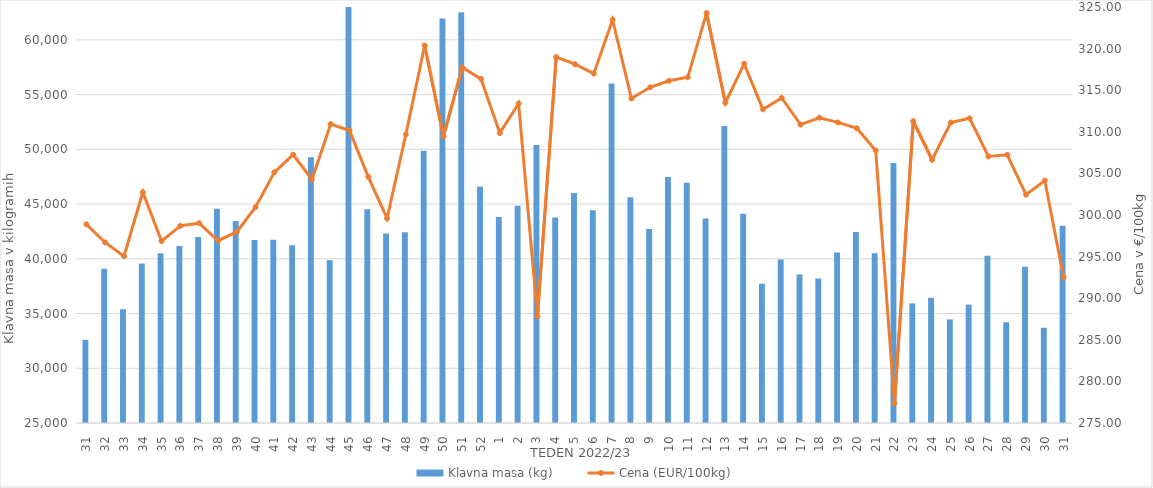
| Category | Klavna masa (kg) |
|---|---|
| 31.0 | 32599 |
| 32.0 | 39100 |
| 33.0 | 35388 |
| 34.0 | 39563 |
| 35.0 | 40507 |
| 36.0 | 41176 |
| 37.0 | 41983 |
| 38.0 | 44572 |
| 39.0 | 43447 |
| 40.0 | 41711 |
| 41.0 | 41736 |
| 42.0 | 41239 |
| 43.0 | 49284 |
| 44.0 | 39877 |
| 45.0 | 63668 |
| 46.0 | 44528 |
| 47.0 | 42319 |
| 48.0 | 42416 |
| 49.0 | 49873 |
| 50.0 | 61942 |
| 51.0 | 62514 |
| 52.0 | 46589 |
| 1.0 | 43807 |
| 2.0 | 44834 |
| 3.0 | 50386 |
| 4.0 | 43773 |
| 5.0 | 46011 |
| 6.0 | 44439 |
| 7.0 | 56001 |
| 8.0 | 45613 |
| 9.0 | 42730 |
| 10.0 | 47471 |
| 11.0 | 46952 |
| 12.0 | 43683 |
| 13.0 | 52135 |
| 14.0 | 44103 |
| 15.0 | 37719 |
| 16.0 | 39943 |
| 17.0 | 38574 |
| 18.0 | 38200 |
| 19.0 | 40581 |
| 20.0 | 42443 |
| 21.0 | 40517 |
| 22.0 | 48742 |
| 23.0 | 35927 |
| 24.0 | 36436 |
| 25.0 | 34463 |
| 26.0 | 35812 |
| 27.0 | 40280 |
| 28.0 | 34201 |
| 29.0 | 39279 |
| 30.0 | 33702 |
| 31.0 | 43020 |